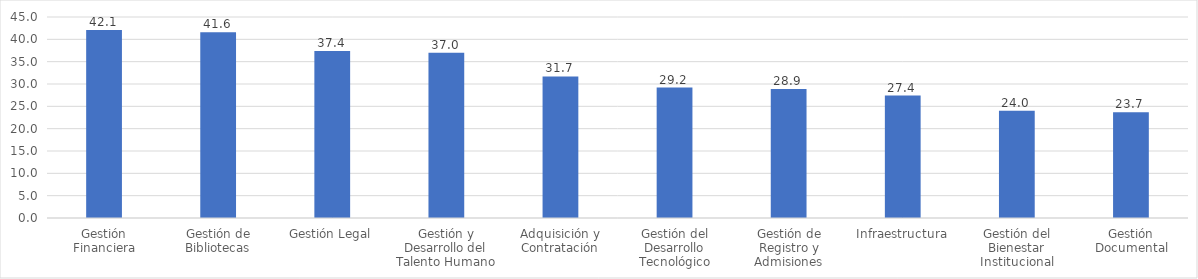
| Category | Series 0 |
|---|---|
| Gestión Financiera | 42.1 |
| Gestión de Bibliotecas | 41.6 |
| Gestión Legal | 37.4 |
| Gestión y Desarrollo del Talento Humano | 37 |
| Adquisición y Contratación | 31.7 |
| Gestión del Desarrollo Tecnológico | 29.2 |
| Gestión de Registro y Admisiones | 28.9 |
| Infraestructura | 27.4 |
| Gestión del Bienestar Institucional | 24 |
| Gestión Documental | 23.7 |